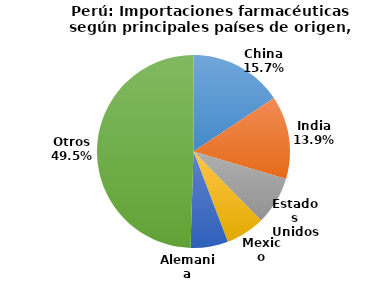
| Category | Series 0 |
|---|---|
| China | 15.663 |
| India | 13.946 |
| Estados Unidos | 8.044 |
| Mexico | 6.558 |
| Alemania | 6.286 |
| Otros | 49.503 |